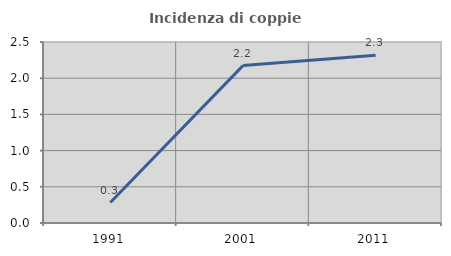
| Category | Incidenza di coppie miste |
|---|---|
| 1991.0 | 0.282 |
| 2001.0 | 2.174 |
| 2011.0 | 2.318 |